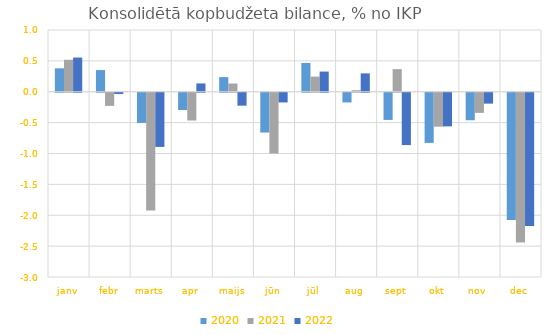
| Category | 2020 | 2021 | 2022 |
|---|---|---|---|
| janv | 0.379 | 0.518 | 0.554 |
| febr | 0.351 | -0.213 | -0.021 |
| marts | -0.489 | -1.906 | -0.877 |
| apr | -0.28 | -0.45 | 0.135 |
| maijs | 0.237 | 0.133 | -0.209 |
| jūn | -0.644 | -0.984 | -0.157 |
| jūl | 0.466 | 0.245 | 0.327 |
| aug | -0.157 | 0.025 | 0.298 |
| sept | -0.44 | 0.367 | -0.847 |
| okt | -0.813 | -0.549 | -0.545 |
| nov | -0.445 | -0.326 | -0.176 |
| dec | -2.059 | -2.423 | -2.159 |